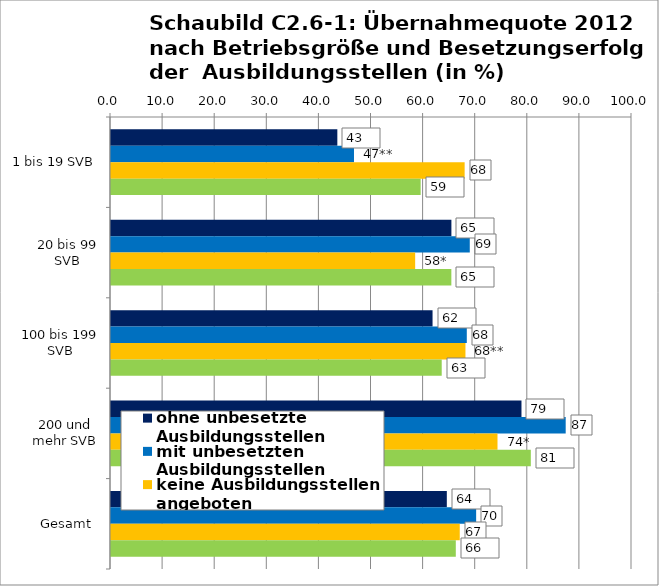
| Category | ohne unbesetzte Ausbildungsstellen  | mit unbesetzten Ausbildungsstellen  | keine Ausbildungsstellen angeboten  | Gesamt  |
|---|---|---|---|---|
|  1 bis 19 SVB | 43.442 | 46.64 | 67.878 | 59.435 |
| 20 bis 99 SVB | 65.336 | 68.863 | 58.381 | 65.326 |
| 100 bis 199 SVB | 61.718 | 68.291 | 68.034 | 63.477 |
| 200 und mehr SVB | 78.786 | 87.273 | 74.185 | 80.581 |
| Gesamt  | 64.458 | 70.086 | 66.939 | 66.181 |